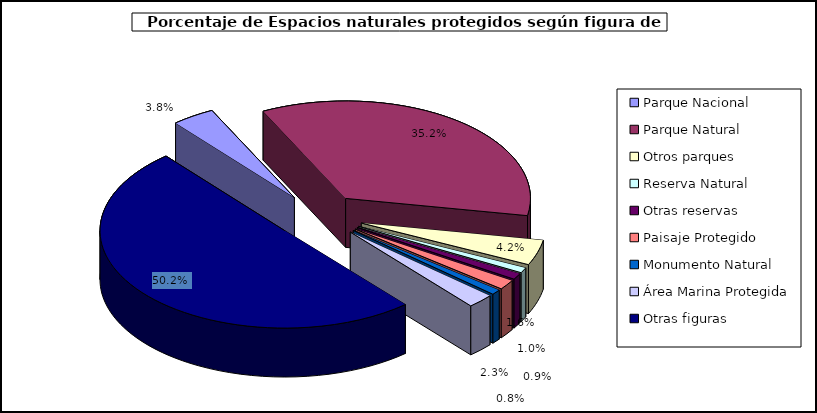
| Category | Parque Nacional Parque Natural Otros parques Reserva Natural Otras reservas Paisaje Protegido Monumento Natural Área Marina Protegida Otras figuras |
|---|---|
| Parque Nacional | 3.751 |
| Parque Natural | 35.192 |
| Otros parques | 4.191 |
| Reserva Natural | 0.876 |
| Otras reservas | 1.001 |
| Paisaje Protegido | 1.624 |
| Monumento Natural | 0.85 |
| Área Marina Protegida | 2.324 |
| Otras figuras | 50.191 |